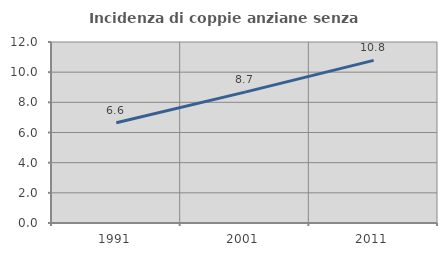
| Category | Incidenza di coppie anziane senza figli  |
|---|---|
| 1991.0 | 6.645 |
| 2001.0 | 8.675 |
| 2011.0 | 10.784 |